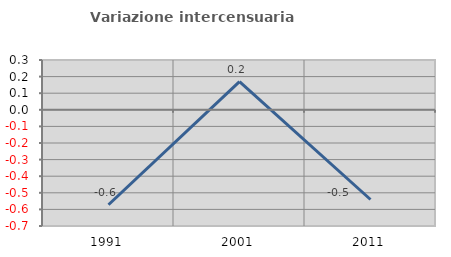
| Category | Variazione intercensuaria annua |
|---|---|
| 1991.0 | -0.572 |
| 2001.0 | 0.17 |
| 2011.0 | -0.54 |